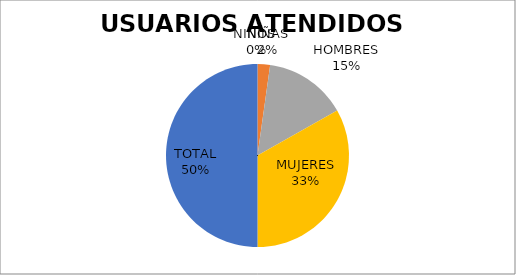
| Category | USUARIOS ATENDIDOS  PORCENTAJE | USUARIOS ATENDIDOS  CANTIDAD |
|---|---|---|
| NIÑOS  | 0 | 0 |
| NIÑAS | 4.425 | 5 |
| HOMBRES | 29.204 | 33 |
| MUJERES | 66.372 | 75 |
| TOTAL | 100 | 113 |